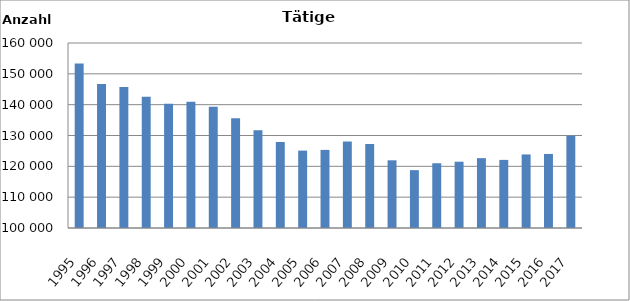
| Category | 1995 1996 1997 1998 1999 2000 2001 2002 2003 2004 2005 2006 2007 2008 2009 2010 2011 2012 2013 2014 2015 2016 2017 |
|---|---|
| 1995 | 153384 |
| 1996 | 146742 |
| 1997 | 145717 |
| 1998 | 142598 |
| 1999 | 140319 |
| 2000 | 140983 |
| 2001 | 139341 |
| 2002 | 135596 |
| 2003 | 131743 |
| 2004 | 127904 |
| 2005 | 125099 |
| 2006 | 125327 |
| 2007 | 128030 |
| 2008 | 127238 |
| 2009 | 121954 |
| 2010 | 118762 |
| 2011 | 121003 |
| 2012 | 121500 |
| 2013 | 122658 |
| 2014 | 122086 |
| 2015 | 123861 |
| 2016 | 124018 |
| 2017 | 129935 |